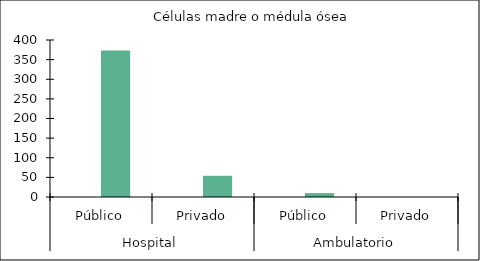
| Category |   |    Células madre o médula ósea |
|---|---|---|
| 0 | 0 | 373 |
| 1 | 0 | 54 |
| 2 | 0 | 10 |
| 3 | 0 | 0 |